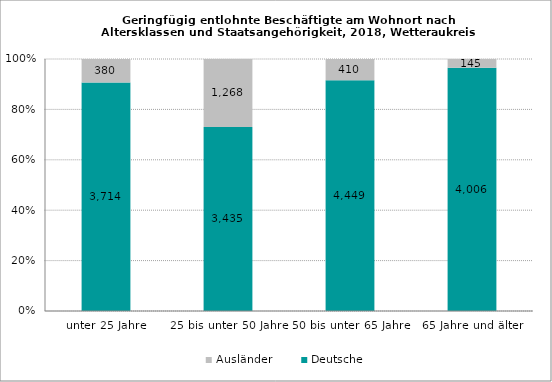
| Category | Deutsche | Ausländer |
|---|---|---|
| unter 25 Jahre | 3714 | 380 |
| 25 bis unter 50 Jahre | 3435 | 1268 |
| 50 bis unter 65 Jahre | 4449 | 410 |
| 65 Jahre und älter | 4006 | 145 |